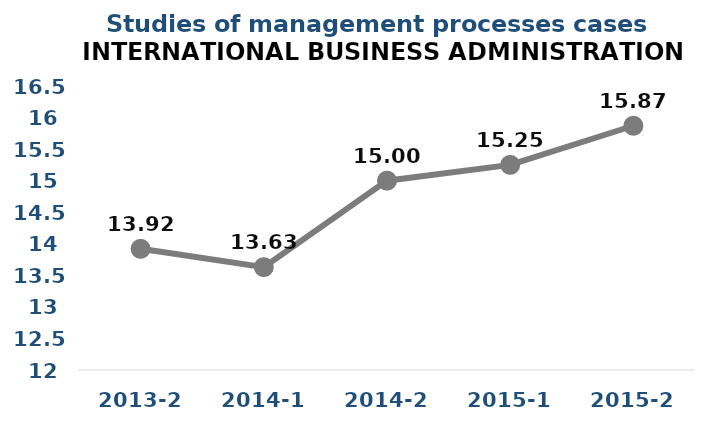
| Category | Series 0 |
|---|---|
| 2013-2 | 13.92 |
| 2014-1 | 13.63 |
| 2014-2 | 15 |
| 2015-1 | 15.25 |
| 2015-2 | 15.87 |